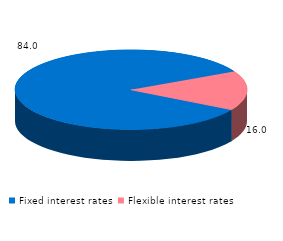
| Category | Series 0 |
|---|---|
| Fixed interest rates | 84.048 |
| Flexible interest rates | 15.952 |